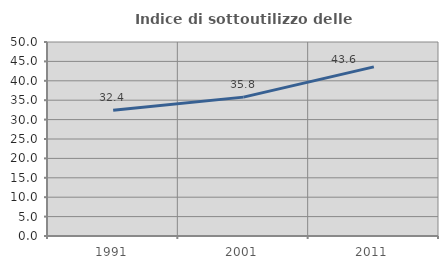
| Category | Indice di sottoutilizzo delle abitazioni  |
|---|---|
| 1991.0 | 32.41 |
| 2001.0 | 35.793 |
| 2011.0 | 43.584 |